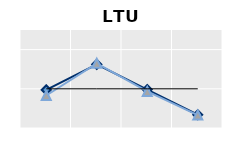
| Category | Né à l'étranger | Né dans le pays | Series 1 |
|---|---|---|---|
| 15-24 | 0.972 | 0.828 | 1 |
| 25-54 | 1.623 | 1.649 | 1 |
| 55-64 | 0.981 | 0.932 | 1 |
| 65+ | 0.338 | 0.329 | 1 |